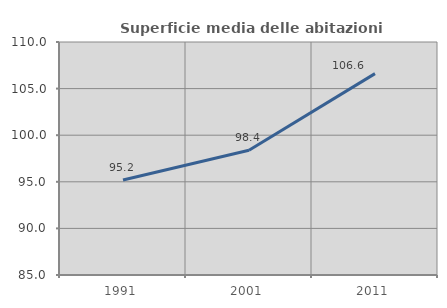
| Category | Superficie media delle abitazioni occupate |
|---|---|
| 1991.0 | 95.186 |
| 2001.0 | 98.378 |
| 2011.0 | 106.609 |